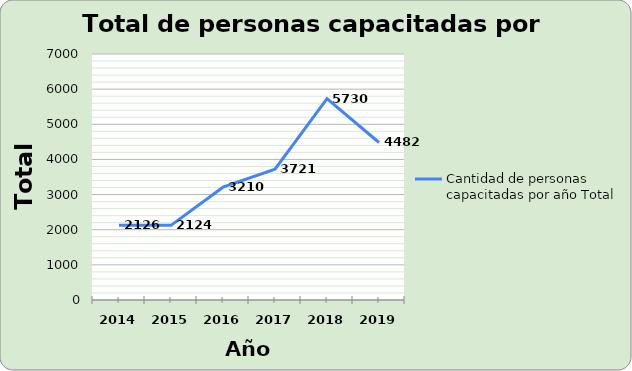
| Category | Cantidad de personas capacitadas por año |
|---|---|
| 2014.0 | 2126 |
| 2015.0 | 2124 |
| 2016.0 | 3210 |
| 2017.0 | 3721 |
| 2018.0 | 5730 |
| 2019.0 | 4482 |